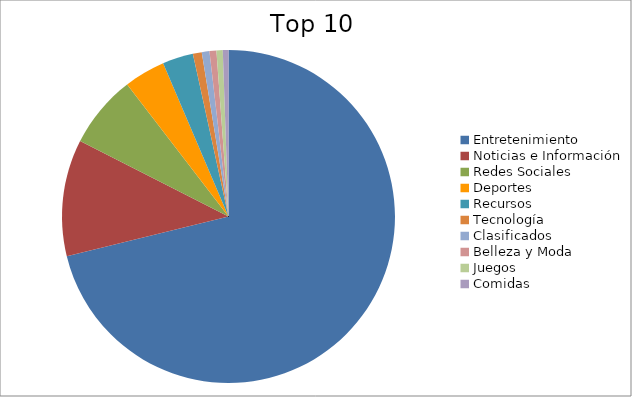
| Category | Series 0 |
|---|---|
| Entretenimiento | 70.05 |
| Noticias e Información | 11.14 |
| Redes Sociales | 6.98 |
| Deportes | 3.93 |
| Recursos | 2.94 |
| Tecnología | 0.85 |
| Clasificados | 0.73 |
| Belleza y Moda | 0.66 |
| Juegos | 0.6 |
| Comidas | 0.54 |